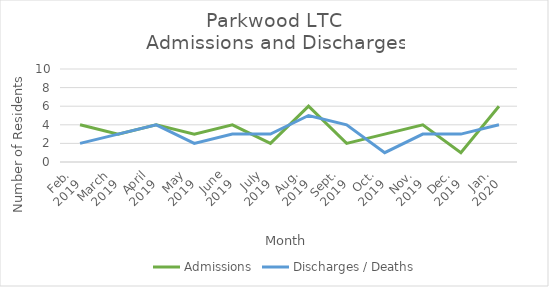
| Category | Admissions | Discharges / Deaths |
|---|---|---|
| Feb.
2019 | 4 | 2 |
| March
2019 | 3 | 3 |
| April
2019 | 4 | 4 |
| May
2019 | 3 | 2 |
| June
2019 | 4 | 3 |
| July
2019 | 2 | 3 |
| Aug.
2019 | 6 | 5 |
| Sept.
2019 | 2 | 4 |
| Oct.
2019 | 3 | 1 |
| Nov.
2019 | 4 | 3 |
| Dec.
2019 | 1 | 3 |
| Jan.
2020 | 6 | 4 |